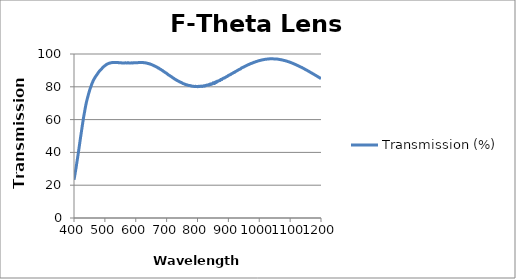
| Category | Transmission (%) |
|---|---|
| 1200.0 | 84.996 |
| 1199.0 | 85.089 |
| 1198.0 | 85.19 |
| 1197.0 | 85.314 |
| 1196.0 | 85.489 |
| 1195.0 | 85.576 |
| 1194.0 | 85.697 |
| 1193.0 | 85.808 |
| 1192.0 | 85.907 |
| 1191.0 | 86.046 |
| 1190.0 | 86.144 |
| 1189.0 | 86.268 |
| 1188.0 | 86.354 |
| 1187.0 | 86.433 |
| 1186.0 | 86.594 |
| 1185.0 | 86.726 |
| 1184.0 | 86.826 |
| 1183.0 | 86.952 |
| 1182.0 | 87.063 |
| 1181.0 | 87.145 |
| 1180.0 | 87.245 |
| 1179.0 | 87.378 |
| 1178.0 | 87.499 |
| 1177.0 | 87.597 |
| 1176.0 | 87.722 |
| 1175.0 | 87.85 |
| 1174.0 | 87.893 |
| 1173.0 | 88.034 |
| 1172.0 | 88.139 |
| 1171.0 | 88.274 |
| 1170.0 | 88.331 |
| 1169.0 | 88.458 |
| 1168.0 | 88.599 |
| 1167.0 | 88.688 |
| 1166.0 | 88.794 |
| 1165.0 | 88.911 |
| 1164.0 | 88.986 |
| 1163.0 | 89.148 |
| 1162.0 | 89.255 |
| 1161.0 | 89.348 |
| 1160.0 | 89.451 |
| 1159.0 | 89.538 |
| 1158.0 | 89.643 |
| 1157.0 | 89.776 |
| 1156.0 | 89.897 |
| 1155.0 | 90.001 |
| 1154.0 | 90.072 |
| 1153.0 | 90.215 |
| 1152.0 | 90.283 |
| 1151.0 | 90.399 |
| 1150.0 | 90.493 |
| 1149.0 | 90.59 |
| 1148.0 | 90.706 |
| 1147.0 | 90.804 |
| 1146.0 | 90.919 |
| 1145.0 | 91.038 |
| 1144.0 | 91.126 |
| 1143.0 | 91.263 |
| 1142.0 | 91.356 |
| 1141.0 | 91.44 |
| 1140.0 | 91.529 |
| 1139.0 | 91.654 |
| 1138.0 | 91.756 |
| 1137.0 | 91.84 |
| 1136.0 | 91.914 |
| 1135.0 | 92.014 |
| 1134.0 | 92.101 |
| 1133.0 | 92.184 |
| 1132.0 | 92.293 |
| 1131.0 | 92.377 |
| 1130.0 | 92.478 |
| 1129.0 | 92.549 |
| 1128.0 | 92.646 |
| 1127.0 | 92.741 |
| 1126.0 | 92.847 |
| 1125.0 | 92.912 |
| 1124.0 | 93.009 |
| 1123.0 | 93.114 |
| 1122.0 | 93.149 |
| 1121.0 | 93.24 |
| 1120.0 | 93.359 |
| 1119.0 | 93.475 |
| 1118.0 | 93.534 |
| 1117.0 | 93.604 |
| 1116.0 | 93.689 |
| 1115.0 | 93.792 |
| 1114.0 | 93.893 |
| 1113.0 | 93.973 |
| 1112.0 | 94.024 |
| 1111.0 | 94.106 |
| 1110.0 | 94.195 |
| 1109.0 | 94.279 |
| 1108.0 | 94.341 |
| 1107.0 | 94.428 |
| 1106.0 | 94.513 |
| 1105.0 | 94.567 |
| 1104.0 | 94.661 |
| 1103.0 | 94.71 |
| 1102.0 | 94.793 |
| 1101.0 | 94.849 |
| 1100.0 | 94.949 |
| 1099.0 | 94.985 |
| 1098.0 | 95.068 |
| 1097.0 | 95.147 |
| 1096.0 | 95.217 |
| 1095.0 | 95.266 |
| 1094.0 | 95.319 |
| 1093.0 | 95.381 |
| 1092.0 | 95.413 |
| 1091.0 | 95.483 |
| 1090.0 | 95.577 |
| 1089.0 | 95.656 |
| 1088.0 | 95.7 |
| 1087.0 | 95.754 |
| 1086.0 | 95.811 |
| 1085.0 | 95.838 |
| 1084.0 | 95.927 |
| 1083.0 | 95.968 |
| 1082.0 | 95.984 |
| 1081.0 | 96 |
| 1080.0 | 96.089 |
| 1079.0 | 96.155 |
| 1078.0 | 96.211 |
| 1077.0 | 96.245 |
| 1076.0 | 96.292 |
| 1075.0 | 96.332 |
| 1074.0 | 96.363 |
| 1073.0 | 96.395 |
| 1072.0 | 96.467 |
| 1071.0 | 96.498 |
| 1070.0 | 96.51 |
| 1069.0 | 96.547 |
| 1068.0 | 96.59 |
| 1067.0 | 96.662 |
| 1066.0 | 96.695 |
| 1065.0 | 96.699 |
| 1064.0 | 96.708 |
| 1063.0 | 96.765 |
| 1062.0 | 96.8 |
| 1061.0 | 96.825 |
| 1060.0 | 96.859 |
| 1059.0 | 96.886 |
| 1058.0 | 96.888 |
| 1057.0 | 96.887 |
| 1056.0 | 96.914 |
| 1055.0 | 96.956 |
| 1054.0 | 96.971 |
| 1053.0 | 96.957 |
| 1052.0 | 96.967 |
| 1051.0 | 96.993 |
| 1050.0 | 96.997 |
| 1049.0 | 96.998 |
| 1048.0 | 97.02 |
| 1047.0 | 97.016 |
| 1046.0 | 97.026 |
| 1045.0 | 97.058 |
| 1044.0 | 97.085 |
| 1043.0 | 97.091 |
| 1042.0 | 97.073 |
| 1041.0 | 97.063 |
| 1040.0 | 97.076 |
| 1039.0 | 97.105 |
| 1038.0 | 97.128 |
| 1037.0 | 97.077 |
| 1036.0 | 97.035 |
| 1035.0 | 97.035 |
| 1034.0 | 97.023 |
| 1033.0 | 97.021 |
| 1032.0 | 97.044 |
| 1031.0 | 97.018 |
| 1030.0 | 96.963 |
| 1029.0 | 96.94 |
| 1028.0 | 96.939 |
| 1027.0 | 96.915 |
| 1026.0 | 96.899 |
| 1025.0 | 96.874 |
| 1024.0 | 96.853 |
| 1023.0 | 96.835 |
| 1022.0 | 96.825 |
| 1021.0 | 96.823 |
| 1020.0 | 96.797 |
| 1019.0 | 96.751 |
| 1018.0 | 96.7 |
| 1017.0 | 96.665 |
| 1016.0 | 96.636 |
| 1015.0 | 96.58 |
| 1014.0 | 96.564 |
| 1013.0 | 96.565 |
| 1012.0 | 96.498 |
| 1011.0 | 96.438 |
| 1010.0 | 96.41 |
| 1009.0 | 96.379 |
| 1008.0 | 96.334 |
| 1007.0 | 96.303 |
| 1006.0 | 96.256 |
| 1005.0 | 96.177 |
| 1004.0 | 96.148 |
| 1003.0 | 96.118 |
| 1002.0 | 96.042 |
| 1001.0 | 96.006 |
| 1000.0 | 95.949 |
| 999.0 | 95.883 |
| 998.0 | 95.86 |
| 997.0 | 95.816 |
| 996.0 | 95.747 |
| 995.0 | 95.668 |
| 994.0 | 95.607 |
| 993.0 | 95.54 |
| 992.0 | 95.473 |
| 991.0 | 95.425 |
| 990.0 | 95.393 |
| 989.0 | 95.336 |
| 988.0 | 95.246 |
| 987.0 | 95.149 |
| 986.0 | 95.079 |
| 985.0 | 95.029 |
| 984.0 | 94.983 |
| 983.0 | 94.936 |
| 982.0 | 94.819 |
| 981.0 | 94.69 |
| 980.0 | 94.652 |
| 979.0 | 94.659 |
| 978.0 | 94.554 |
| 977.0 | 94.423 |
| 976.0 | 94.333 |
| 975.0 | 94.311 |
| 974.0 | 94.229 |
| 973.0 | 94.16 |
| 972.0 | 94.145 |
| 971.0 | 94.044 |
| 970.0 | 93.921 |
| 969.0 | 93.82 |
| 968.0 | 93.723 |
| 967.0 | 93.653 |
| 966.0 | 93.598 |
| 965.0 | 93.533 |
| 964.0 | 93.458 |
| 963.0 | 93.34 |
| 962.0 | 93.252 |
| 961.0 | 93.151 |
| 960.0 | 93.049 |
| 959.0 | 92.955 |
| 958.0 | 92.865 |
| 957.0 | 92.819 |
| 956.0 | 92.714 |
| 955.0 | 92.603 |
| 954.0 | 92.515 |
| 953.0 | 92.396 |
| 952.0 | 92.297 |
| 951.0 | 92.174 |
| 950.0 | 92.114 |
| 949.0 | 91.99 |
| 948.0 | 91.92 |
| 947.0 | 91.831 |
| 946.0 | 91.73 |
| 945.0 | 91.7 |
| 944.0 | 91.637 |
| 943.0 | 91.534 |
| 942.0 | 91.403 |
| 941.0 | 91.18 |
| 940.0 | 90.968 |
| 939.0 | 90.895 |
| 938.0 | 90.821 |
| 937.0 | 90.721 |
| 936.0 | 90.593 |
| 935.0 | 90.578 |
| 934.0 | 90.515 |
| 933.0 | 90.338 |
| 932.0 | 90.23 |
| 931.0 | 90.174 |
| 930.0 | 90.023 |
| 929.0 | 89.899 |
| 928.0 | 89.822 |
| 927.0 | 89.696 |
| 926.0 | 89.578 |
| 925.0 | 89.473 |
| 924.0 | 89.437 |
| 923.0 | 89.3 |
| 922.0 | 89.037 |
| 921.0 | 88.91 |
| 920.0 | 88.95 |
| 919.0 | 88.834 |
| 918.0 | 88.68 |
| 917.0 | 88.707 |
| 916.0 | 88.553 |
| 915.0 | 88.434 |
| 914.0 | 88.274 |
| 913.0 | 88.171 |
| 912.0 | 88.051 |
| 911.0 | 87.984 |
| 910.0 | 87.861 |
| 909.0 | 87.866 |
| 908.0 | 87.531 |
| 907.0 | 87.47 |
| 906.0 | 87.363 |
| 905.0 | 87.336 |
| 904.0 | 87.219 |
| 903.0 | 87.178 |
| 902.0 | 87.074 |
| 901.0 | 87.026 |
| 900.0 | 86.91 |
| 899.0 | 86.683 |
| 898.0 | 86.551 |
| 897.0 | 86.399 |
| 896.0 | 86.282 |
| 895.0 | 86.266 |
| 894.0 | 86.18 |
| 893.0 | 86.057 |
| 892.0 | 85.893 |
| 891.0 | 85.803 |
| 890.0 | 85.712 |
| 889.0 | 85.632 |
| 888.0 | 85.484 |
| 887.0 | 85.297 |
| 886.0 | 85.442 |
| 885.0 | 85.21 |
| 884.0 | 85.236 |
| 883.0 | 85.152 |
| 882.0 | 85.012 |
| 881.0 | 84.963 |
| 880.0 | 84.711 |
| 879.0 | 84.43 |
| 878.0 | 84.481 |
| 877.0 | 84.443 |
| 876.0 | 84.357 |
| 875.0 | 84.441 |
| 874.0 | 84.102 |
| 873.0 | 83.803 |
| 872.0 | 83.962 |
| 871.0 | 83.821 |
| 870.0 | 83.713 |
| 869.0 | 83.686 |
| 868.0 | 83.501 |
| 867.0 | 83.492 |
| 866.0 | 83.44 |
| 865.0 | 83.178 |
| 864.0 | 83.441 |
| 863.0 | 83.028 |
| 862.0 | 82.973 |
| 861.0 | 82.641 |
| 860.0 | 83.017 |
| 859.0 | 82.981 |
| 858.0 | 82.568 |
| 857.0 | 82.622 |
| 856.0 | 82.704 |
| 855.0 | 81.989 |
| 854.0 | 82.243 |
| 853.0 | 82.318 |
| 852.0 | 82.31 |
| 851.0 | 82.485 |
| 850.0 | 82.117 |
| 849.0 | 81.95 |
| 848.0 | 81.715 |
| 847.0 | 81.726 |
| 846.0 | 81.784 |
| 845.0 | 81.843 |
| 844.0 | 81.638 |
| 843.0 | 81.366 |
| 842.0 | 81.725 |
| 841.0 | 81.628 |
| 840.0 | 81.556 |
| 839.0 | 81.542 |
| 838.0 | 81.225 |
| 837.0 | 81.02 |
| 836.0 | 81.153 |
| 835.0 | 81.184 |
| 834.0 | 80.999 |
| 833.0 | 81.102 |
| 832.0 | 81.034 |
| 831.0 | 80.988 |
| 830.0 | 81.03 |
| 829.0 | 80.871 |
| 828.0 | 80.923 |
| 827.0 | 80.653 |
| 826.0 | 80.802 |
| 825.0 | 80.771 |
| 824.0 | 80.636 |
| 823.0 | 80.397 |
| 822.0 | 80.478 |
| 821.0 | 80.704 |
| 820.0 | 80.565 |
| 819.0 | 80.407 |
| 818.0 | 80.461 |
| 817.0 | 80.377 |
| 816.0 | 80.29 |
| 815.0 | 80.153 |
| 814.0 | 80.282 |
| 813.0 | 80.313 |
| 812.0 | 80.443 |
| 811.0 | 80.373 |
| 810.0 | 80.25 |
| 809.0 | 80.315 |
| 808.0 | 80.272 |
| 807.0 | 80.2 |
| 806.0 | 80.246 |
| 805.0 | 80.219 |
| 804.0 | 80.358 |
| 803.0 | 80.142 |
| 802.0 | 80.174 |
| 801.0 | 80.044 |
| 800.0 | 80.175 |
| 799.0 | 80.238 |
| 798.0 | 80.167 |
| 797.0 | 80.115 |
| 796.0 | 80.112 |
| 795.0 | 80.171 |
| 794.0 | 80.198 |
| 793.0 | 80.331 |
| 792.0 | 80.178 |
| 791.0 | 80.189 |
| 790.0 | 80.258 |
| 789.0 | 80.231 |
| 788.0 | 80.227 |
| 787.0 | 80.326 |
| 786.0 | 80.304 |
| 785.0 | 80.332 |
| 784.0 | 80.358 |
| 783.0 | 80.419 |
| 782.0 | 80.365 |
| 781.0 | 80.46 |
| 780.0 | 80.469 |
| 779.0 | 80.538 |
| 778.0 | 80.711 |
| 777.0 | 80.597 |
| 776.0 | 80.741 |
| 775.0 | 80.754 |
| 774.0 | 80.854 |
| 773.0 | 80.852 |
| 772.0 | 80.851 |
| 771.0 | 80.752 |
| 770.0 | 80.933 |
| 769.0 | 80.985 |
| 768.0 | 81.047 |
| 767.0 | 81.034 |
| 766.0 | 81.162 |
| 765.0 | 81.208 |
| 764.0 | 81.25 |
| 763.0 | 81.335 |
| 762.0 | 81.361 |
| 761.0 | 81.414 |
| 760.0 | 81.468 |
| 759.0 | 81.58 |
| 758.0 | 81.712 |
| 757.0 | 81.772 |
| 756.0 | 81.805 |
| 755.0 | 81.856 |
| 754.0 | 81.952 |
| 753.0 | 81.964 |
| 752.0 | 82.11 |
| 751.0 | 82.273 |
| 750.0 | 82.307 |
| 749.0 | 82.476 |
| 748.0 | 82.627 |
| 747.0 | 82.584 |
| 746.0 | 82.751 |
| 745.0 | 82.745 |
| 744.0 | 82.87 |
| 743.0 | 83.026 |
| 742.0 | 83.026 |
| 741.0 | 83.19 |
| 740.0 | 83.249 |
| 739.0 | 83.38 |
| 738.0 | 83.473 |
| 737.0 | 83.523 |
| 736.0 | 83.605 |
| 735.0 | 83.794 |
| 734.0 | 83.955 |
| 733.0 | 83.966 |
| 732.0 | 83.992 |
| 731.0 | 84.187 |
| 730.0 | 84.266 |
| 729.0 | 84.477 |
| 728.0 | 84.575 |
| 727.0 | 84.607 |
| 726.0 | 84.767 |
| 725.0 | 84.871 |
| 724.0 | 84.977 |
| 723.0 | 85.17 |
| 722.0 | 85.264 |
| 721.0 | 85.335 |
| 720.0 | 85.591 |
| 719.0 | 85.675 |
| 718.0 | 85.785 |
| 717.0 | 85.901 |
| 716.0 | 86.024 |
| 715.0 | 86.235 |
| 714.0 | 86.3 |
| 713.0 | 86.415 |
| 712.0 | 86.526 |
| 711.0 | 86.691 |
| 710.0 | 86.81 |
| 709.0 | 86.945 |
| 708.0 | 87.059 |
| 707.0 | 87.165 |
| 706.0 | 87.257 |
| 705.0 | 87.432 |
| 704.0 | 87.588 |
| 703.0 | 87.686 |
| 702.0 | 87.895 |
| 701.0 | 88.019 |
| 700.0 | 88.134 |
| 699.0 | 88.321 |
| 698.0 | 88.478 |
| 697.0 | 88.544 |
| 696.0 | 88.625 |
| 695.0 | 88.747 |
| 694.0 | 88.894 |
| 693.0 | 89.015 |
| 692.0 | 89.199 |
| 691.0 | 89.308 |
| 690.0 | 89.432 |
| 689.0 | 89.545 |
| 688.0 | 89.703 |
| 687.0 | 89.892 |
| 686.0 | 90.027 |
| 685.0 | 90.085 |
| 684.0 | 90.175 |
| 683.0 | 90.381 |
| 682.0 | 90.488 |
| 681.0 | 90.573 |
| 680.0 | 90.707 |
| 679.0 | 90.808 |
| 678.0 | 90.883 |
| 677.0 | 90.998 |
| 676.0 | 91.18 |
| 675.0 | 91.358 |
| 674.0 | 91.402 |
| 673.0 | 91.461 |
| 672.0 | 91.509 |
| 671.0 | 91.594 |
| 670.0 | 91.837 |
| 669.0 | 91.984 |
| 668.0 | 92.026 |
| 667.0 | 92.089 |
| 666.0 | 92.2 |
| 665.0 | 92.313 |
| 664.0 | 92.416 |
| 663.0 | 92.505 |
| 662.0 | 92.599 |
| 661.0 | 92.696 |
| 660.0 | 92.796 |
| 659.0 | 92.806 |
| 658.0 | 92.932 |
| 657.0 | 93.091 |
| 656.0 | 93.168 |
| 655.0 | 93.237 |
| 654.0 | 93.313 |
| 653.0 | 93.386 |
| 652.0 | 93.508 |
| 651.0 | 93.604 |
| 650.0 | 93.637 |
| 649.0 | 93.695 |
| 648.0 | 93.752 |
| 647.0 | 93.833 |
| 646.0 | 93.966 |
| 645.0 | 94.019 |
| 644.0 | 93.948 |
| 643.0 | 94.023 |
| 642.0 | 94.112 |
| 641.0 | 94.184 |
| 640.0 | 94.269 |
| 639.0 | 94.291 |
| 638.0 | 94.272 |
| 637.0 | 94.324 |
| 636.0 | 94.437 |
| 635.0 | 94.453 |
| 634.0 | 94.502 |
| 633.0 | 94.57 |
| 632.0 | 94.565 |
| 631.0 | 94.613 |
| 630.0 | 94.624 |
| 629.0 | 94.604 |
| 628.0 | 94.681 |
| 627.0 | 94.703 |
| 626.0 | 94.712 |
| 625.0 | 94.741 |
| 624.0 | 94.79 |
| 623.0 | 94.791 |
| 622.0 | 94.788 |
| 621.0 | 94.821 |
| 620.0 | 94.806 |
| 619.0 | 94.817 |
| 618.0 | 94.813 |
| 617.0 | 94.802 |
| 616.0 | 94.824 |
| 615.0 | 94.875 |
| 614.0 | 94.88 |
| 613.0 | 94.825 |
| 612.0 | 94.803 |
| 611.0 | 94.799 |
| 610.0 | 94.79 |
| 609.0 | 94.789 |
| 608.0 | 94.736 |
| 607.0 | 94.717 |
| 606.0 | 94.722 |
| 605.0 | 94.688 |
| 604.0 | 94.729 |
| 603.0 | 94.707 |
| 602.0 | 94.625 |
| 601.0 | 94.639 |
| 600.0 | 94.696 |
| 599.0 | 94.714 |
| 598.0 | 94.623 |
| 597.0 | 94.612 |
| 596.0 | 94.677 |
| 595.0 | 94.658 |
| 594.0 | 94.63 |
| 593.0 | 94.573 |
| 592.0 | 94.606 |
| 591.0 | 94.616 |
| 590.0 | 94.558 |
| 589.0 | 94.552 |
| 588.0 | 94.527 |
| 587.0 | 94.573 |
| 586.0 | 94.618 |
| 585.0 | 94.595 |
| 584.0 | 94.528 |
| 583.0 | 94.529 |
| 582.0 | 94.505 |
| 581.0 | 94.527 |
| 580.0 | 94.579 |
| 579.0 | 94.539 |
| 578.0 | 94.541 |
| 577.0 | 94.599 |
| 576.0 | 94.619 |
| 575.0 | 94.573 |
| 574.0 | 94.628 |
| 573.0 | 94.629 |
| 572.0 | 94.558 |
| 571.0 | 94.562 |
| 570.0 | 94.572 |
| 569.0 | 94.546 |
| 568.0 | 94.592 |
| 567.0 | 94.615 |
| 566.0 | 94.635 |
| 565.0 | 94.548 |
| 564.0 | 94.537 |
| 563.0 | 94.556 |
| 562.0 | 94.56 |
| 561.0 | 94.546 |
| 560.0 | 94.541 |
| 559.0 | 94.534 |
| 558.0 | 94.509 |
| 557.0 | 94.576 |
| 556.0 | 94.58 |
| 555.0 | 94.579 |
| 554.0 | 94.552 |
| 553.0 | 94.626 |
| 552.0 | 94.695 |
| 551.0 | 94.658 |
| 550.0 | 94.642 |
| 549.0 | 94.653 |
| 548.0 | 94.7 |
| 547.0 | 94.645 |
| 546.0 | 94.624 |
| 545.0 | 94.718 |
| 544.0 | 94.688 |
| 543.0 | 94.793 |
| 542.0 | 94.815 |
| 541.0 | 94.743 |
| 540.0 | 94.749 |
| 539.0 | 94.796 |
| 538.0 | 94.821 |
| 537.0 | 94.82 |
| 536.0 | 94.824 |
| 535.0 | 94.819 |
| 534.0 | 94.887 |
| 533.0 | 94.88 |
| 532.0 | 94.857 |
| 531.0 | 94.849 |
| 530.0 | 94.802 |
| 529.0 | 94.855 |
| 528.0 | 94.894 |
| 527.0 | 94.877 |
| 526.0 | 94.803 |
| 525.0 | 94.762 |
| 524.0 | 94.737 |
| 523.0 | 94.804 |
| 522.0 | 94.738 |
| 521.0 | 94.719 |
| 520.0 | 94.618 |
| 519.0 | 94.574 |
| 518.0 | 94.566 |
| 517.0 | 94.544 |
| 516.0 | 94.478 |
| 515.0 | 94.442 |
| 514.0 | 94.324 |
| 513.0 | 94.298 |
| 512.0 | 94.282 |
| 511.0 | 94.144 |
| 510.0 | 94.041 |
| 509.0 | 93.952 |
| 508.0 | 93.895 |
| 507.0 | 93.808 |
| 506.0 | 93.722 |
| 505.0 | 93.574 |
| 504.0 | 93.424 |
| 503.0 | 93.328 |
| 502.0 | 93.145 |
| 501.0 | 92.996 |
| 500.0 | 92.86 |
| 499.0 | 92.739 |
| 498.0 | 92.592 |
| 497.0 | 92.422 |
| 496.0 | 92.247 |
| 495.0 | 92.037 |
| 494.0 | 91.905 |
| 493.0 | 91.664 |
| 492.0 | 91.508 |
| 491.0 | 91.276 |
| 490.0 | 91.056 |
| 489.0 | 90.857 |
| 488.0 | 90.681 |
| 487.0 | 90.47 |
| 486.0 | 90.288 |
| 485.0 | 90.061 |
| 484.0 | 89.828 |
| 483.0 | 89.677 |
| 482.0 | 89.466 |
| 481.0 | 89.225 |
| 480.0 | 88.987 |
| 479.0 | 88.733 |
| 478.0 | 88.418 |
| 477.0 | 88.123 |
| 476.0 | 87.894 |
| 475.0 | 87.607 |
| 474.0 | 87.337 |
| 473.0 | 87.081 |
| 472.0 | 86.842 |
| 471.0 | 86.555 |
| 470.0 | 86.283 |
| 469.0 | 85.902 |
| 468.0 | 85.6 |
| 467.0 | 85.407 |
| 466.0 | 84.988 |
| 465.0 | 84.702 |
| 464.0 | 84.329 |
| 463.0 | 83.988 |
| 462.0 | 83.621 |
| 461.0 | 83.169 |
| 460.0 | 82.764 |
| 459.0 | 82.393 |
| 458.0 | 81.829 |
| 457.0 | 81.345 |
| 456.0 | 80.85 |
| 455.0 | 80.28 |
| 454.0 | 79.727 |
| 453.0 | 79.178 |
| 452.0 | 78.613 |
| 451.0 | 78.086 |
| 450.0 | 77.459 |
| 449.0 | 76.856 |
| 448.0 | 76.157 |
| 447.0 | 75.568 |
| 446.0 | 74.793 |
| 445.0 | 74.135 |
| 444.0 | 73.395 |
| 443.0 | 72.731 |
| 442.0 | 71.946 |
| 441.0 | 71.206 |
| 440.0 | 70.406 |
| 439.0 | 69.51 |
| 438.0 | 68.6 |
| 437.0 | 67.574 |
| 436.0 | 66.595 |
| 435.0 | 65.454 |
| 434.0 | 64.478 |
| 433.0 | 63.437 |
| 432.0 | 62.371 |
| 431.0 | 61.25 |
| 430.0 | 60.083 |
| 429.0 | 58.914 |
| 428.0 | 57.67 |
| 427.0 | 56.428 |
| 426.0 | 55.087 |
| 425.0 | 53.871 |
| 424.0 | 52.58 |
| 423.0 | 51.29 |
| 422.0 | 50.105 |
| 421.0 | 48.865 |
| 420.0 | 47.523 |
| 419.0 | 46.194 |
| 418.0 | 44.888 |
| 417.0 | 43.546 |
| 416.0 | 42.227 |
| 415.0 | 40.929 |
| 414.0 | 39.651 |
| 413.0 | 38.386 |
| 412.0 | 37.181 |
| 411.0 | 35.912 |
| 410.0 | 34.759 |
| 409.0 | 33.547 |
| 408.0 | 32.255 |
| 407.0 | 31.038 |
| 406.0 | 29.864 |
| 405.0 | 28.669 |
| 404.0 | 27.568 |
| 403.0 | 26.449 |
| 402.0 | 25.391 |
| 401.0 | 24.319 |
| 400.0 | 23.265 |